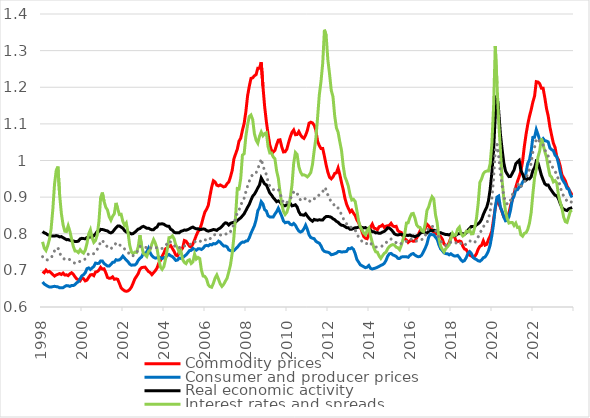
| Category | Commodity prices | Consumer and producer prices | Real economic activity | Interest rates and spreads | p.m. EA macroeconomic uncertainty |
|---|---|---|---|---|---|
| 1998-02-01 | 0.697 | 0.668 | 0.806 | 0.778 | 0.737 |
| 1998-03-01 | 0.694 | 0.663 | 0.802 | 0.761 | 0.731 |
| 1998-04-01 | 0.701 | 0.66 | 0.801 | 0.754 | 0.729 |
| 1998-05-01 | 0.696 | 0.657 | 0.797 | 0.767 | 0.728 |
| 1998-06-01 | 0.697 | 0.654 | 0.796 | 0.784 | 0.73 |
| 1998-07-01 | 0.693 | 0.655 | 0.794 | 0.813 | 0.734 |
| 1998-08-01 | 0.689 | 0.656 | 0.794 | 0.866 | 0.742 |
| 1998-09-01 | 0.684 | 0.657 | 0.794 | 0.935 | 0.753 |
| 1998-10-01 | 0.688 | 0.656 | 0.795 | 0.973 | 0.76 |
| 1998-11-01 | 0.689 | 0.655 | 0.794 | 0.983 | 0.762 |
| 1998-12-01 | 0.691 | 0.652 | 0.792 | 0.906 | 0.747 |
| 1999-01-01 | 0.689 | 0.653 | 0.792 | 0.856 | 0.739 |
| 1999-02-01 | 0.693 | 0.653 | 0.789 | 0.825 | 0.734 |
| 1999-03-01 | 0.687 | 0.656 | 0.787 | 0.807 | 0.73 |
| 1999-04-01 | 0.688 | 0.658 | 0.784 | 0.806 | 0.73 |
| 1999-05-01 | 0.686 | 0.658 | 0.784 | 0.822 | 0.732 |
| 1999-06-01 | 0.691 | 0.656 | 0.782 | 0.807 | 0.729 |
| 1999-07-01 | 0.694 | 0.659 | 0.781 | 0.786 | 0.726 |
| 1999-08-01 | 0.689 | 0.658 | 0.78 | 0.765 | 0.722 |
| 1999-09-01 | 0.682 | 0.661 | 0.779 | 0.753 | 0.719 |
| 1999-10-01 | 0.677 | 0.666 | 0.779 | 0.752 | 0.72 |
| 1999-11-01 | 0.675 | 0.669 | 0.78 | 0.749 | 0.72 |
| 1999-12-01 | 0.672 | 0.677 | 0.786 | 0.756 | 0.726 |
| 2000-01-01 | 0.68 | 0.685 | 0.788 | 0.751 | 0.729 |
| 2000-02-01 | 0.677 | 0.688 | 0.787 | 0.747 | 0.729 |
| 2000-03-01 | 0.671 | 0.694 | 0.786 | 0.755 | 0.731 |
| 2000-04-01 | 0.673 | 0.705 | 0.79 | 0.774 | 0.739 |
| 2000-05-01 | 0.681 | 0.707 | 0.79 | 0.8 | 0.746 |
| 2000-06-01 | 0.688 | 0.703 | 0.791 | 0.811 | 0.748 |
| 2000-07-01 | 0.689 | 0.707 | 0.791 | 0.789 | 0.746 |
| 2000-08-01 | 0.686 | 0.711 | 0.795 | 0.776 | 0.745 |
| 2000-09-01 | 0.696 | 0.72 | 0.799 | 0.782 | 0.753 |
| 2000-10-01 | 0.697 | 0.719 | 0.806 | 0.797 | 0.757 |
| 2000-11-01 | 0.701 | 0.719 | 0.807 | 0.834 | 0.764 |
| 2000-12-01 | 0.708 | 0.726 | 0.812 | 0.899 | 0.78 |
| 2001-01-01 | 0.703 | 0.726 | 0.812 | 0.913 | 0.782 |
| 2001-02-01 | 0.704 | 0.719 | 0.81 | 0.888 | 0.775 |
| 2001-03-01 | 0.694 | 0.715 | 0.809 | 0.872 | 0.769 |
| 2001-04-01 | 0.681 | 0.712 | 0.808 | 0.865 | 0.764 |
| 2001-05-01 | 0.678 | 0.712 | 0.804 | 0.846 | 0.759 |
| 2001-06-01 | 0.679 | 0.716 | 0.802 | 0.837 | 0.759 |
| 2001-07-01 | 0.682 | 0.722 | 0.805 | 0.848 | 0.764 |
| 2001-08-01 | 0.676 | 0.723 | 0.811 | 0.855 | 0.766 |
| 2001-09-01 | 0.677 | 0.729 | 0.817 | 0.884 | 0.775 |
| 2001-10-01 | 0.676 | 0.728 | 0.821 | 0.868 | 0.773 |
| 2001-11-01 | 0.664 | 0.729 | 0.821 | 0.852 | 0.769 |
| 2001-12-01 | 0.652 | 0.733 | 0.818 | 0.853 | 0.768 |
| 2002-01-01 | 0.648 | 0.739 | 0.815 | 0.834 | 0.765 |
| 2002-02-01 | 0.644 | 0.733 | 0.809 | 0.823 | 0.759 |
| 2002-03-01 | 0.643 | 0.728 | 0.805 | 0.829 | 0.756 |
| 2002-04-01 | 0.644 | 0.724 | 0.803 | 0.804 | 0.75 |
| 2002-05-01 | 0.648 | 0.717 | 0.802 | 0.769 | 0.742 |
| 2002-06-01 | 0.654 | 0.714 | 0.799 | 0.751 | 0.739 |
| 2002-07-01 | 0.665 | 0.715 | 0.8 | 0.746 | 0.74 |
| 2002-08-01 | 0.677 | 0.715 | 0.804 | 0.75 | 0.744 |
| 2002-09-01 | 0.684 | 0.719 | 0.808 | 0.749 | 0.748 |
| 2002-10-01 | 0.691 | 0.727 | 0.813 | 0.764 | 0.756 |
| 2002-11-01 | 0.703 | 0.733 | 0.814 | 0.796 | 0.766 |
| 2002-12-01 | 0.708 | 0.737 | 0.818 | 0.767 | 0.764 |
| 2003-01-01 | 0.708 | 0.747 | 0.82 | 0.746 | 0.765 |
| 2003-02-01 | 0.709 | 0.746 | 0.818 | 0.743 | 0.763 |
| 2003-03-01 | 0.703 | 0.75 | 0.815 | 0.738 | 0.762 |
| 2003-04-01 | 0.697 | 0.76 | 0.815 | 0.751 | 0.767 |
| 2003-05-01 | 0.694 | 0.748 | 0.813 | 0.757 | 0.762 |
| 2003-06-01 | 0.688 | 0.74 | 0.811 | 0.772 | 0.76 |
| 2003-07-01 | 0.694 | 0.736 | 0.811 | 0.784 | 0.762 |
| 2003-08-01 | 0.699 | 0.733 | 0.816 | 0.774 | 0.762 |
| 2003-09-01 | 0.706 | 0.734 | 0.818 | 0.76 | 0.762 |
| 2003-10-01 | 0.719 | 0.736 | 0.826 | 0.732 | 0.763 |
| 2003-11-01 | 0.727 | 0.735 | 0.827 | 0.709 | 0.76 |
| 2003-12-01 | 0.738 | 0.732 | 0.827 | 0.703 | 0.76 |
| 2004-01-01 | 0.747 | 0.735 | 0.826 | 0.71 | 0.763 |
| 2004-02-01 | 0.759 | 0.735 | 0.823 | 0.731 | 0.768 |
| 2004-03-01 | 0.761 | 0.741 | 0.821 | 0.757 | 0.774 |
| 2004-04-01 | 0.765 | 0.743 | 0.82 | 0.789 | 0.78 |
| 2004-05-01 | 0.768 | 0.74 | 0.812 | 0.79 | 0.777 |
| 2004-06-01 | 0.76 | 0.738 | 0.81 | 0.794 | 0.775 |
| 2004-07-01 | 0.752 | 0.733 | 0.804 | 0.786 | 0.769 |
| 2004-08-01 | 0.742 | 0.727 | 0.803 | 0.769 | 0.762 |
| 2004-09-01 | 0.74 | 0.728 | 0.803 | 0.762 | 0.761 |
| 2004-10-01 | 0.75 | 0.734 | 0.803 | 0.749 | 0.762 |
| 2004-11-01 | 0.755 | 0.733 | 0.807 | 0.753 | 0.764 |
| 2004-12-01 | 0.761 | 0.734 | 0.808 | 0.73 | 0.762 |
| 2005-01-01 | 0.782 | 0.739 | 0.81 | 0.722 | 0.767 |
| 2005-02-01 | 0.78 | 0.742 | 0.81 | 0.718 | 0.767 |
| 2005-03-01 | 0.773 | 0.748 | 0.811 | 0.727 | 0.77 |
| 2005-04-01 | 0.766 | 0.754 | 0.814 | 0.729 | 0.772 |
| 2005-05-01 | 0.763 | 0.755 | 0.816 | 0.719 | 0.771 |
| 2005-06-01 | 0.772 | 0.76 | 0.818 | 0.723 | 0.775 |
| 2005-07-01 | 0.783 | 0.757 | 0.815 | 0.744 | 0.779 |
| 2005-08-01 | 0.796 | 0.755 | 0.813 | 0.731 | 0.777 |
| 2005-09-01 | 0.806 | 0.759 | 0.814 | 0.735 | 0.781 |
| 2005-10-01 | 0.811 | 0.759 | 0.812 | 0.732 | 0.781 |
| 2005-11-01 | 0.825 | 0.757 | 0.812 | 0.7 | 0.777 |
| 2005-12-01 | 0.843 | 0.761 | 0.813 | 0.685 | 0.779 |
| 2006-01-01 | 0.859 | 0.767 | 0.812 | 0.683 | 0.783 |
| 2006-02-01 | 0.867 | 0.768 | 0.809 | 0.676 | 0.783 |
| 2006-03-01 | 0.877 | 0.767 | 0.807 | 0.66 | 0.781 |
| 2006-04-01 | 0.903 | 0.771 | 0.808 | 0.656 | 0.786 |
| 2006-05-01 | 0.927 | 0.77 | 0.81 | 0.654 | 0.79 |
| 2006-06-01 | 0.945 | 0.773 | 0.812 | 0.665 | 0.796 |
| 2006-07-01 | 0.941 | 0.772 | 0.811 | 0.679 | 0.798 |
| 2006-08-01 | 0.933 | 0.775 | 0.809 | 0.687 | 0.798 |
| 2006-09-01 | 0.931 | 0.78 | 0.813 | 0.676 | 0.799 |
| 2006-10-01 | 0.933 | 0.777 | 0.816 | 0.663 | 0.797 |
| 2006-11-01 | 0.931 | 0.771 | 0.82 | 0.656 | 0.795 |
| 2006-12-01 | 0.928 | 0.767 | 0.826 | 0.662 | 0.796 |
| 2007-01-01 | 0.929 | 0.767 | 0.83 | 0.67 | 0.799 |
| 2007-02-01 | 0.937 | 0.764 | 0.829 | 0.678 | 0.8 |
| 2007-03-01 | 0.941 | 0.756 | 0.824 | 0.696 | 0.799 |
| 2007-04-01 | 0.955 | 0.754 | 0.829 | 0.715 | 0.806 |
| 2007-05-01 | 0.973 | 0.754 | 0.83 | 0.747 | 0.814 |
| 2007-06-01 | 1.004 | 0.754 | 0.832 | 0.791 | 0.828 |
| 2007-07-01 | 1.018 | 0.759 | 0.832 | 0.848 | 0.841 |
| 2007-08-01 | 1.031 | 0.763 | 0.836 | 0.923 | 0.859 |
| 2007-09-01 | 1.053 | 0.769 | 0.84 | 0.922 | 0.865 |
| 2007-10-01 | 1.061 | 0.774 | 0.844 | 0.951 | 0.875 |
| 2007-11-01 | 1.083 | 0.777 | 0.849 | 1.015 | 0.892 |
| 2007-12-01 | 1.101 | 0.777 | 0.854 | 1.018 | 0.897 |
| 2008-01-01 | 1.133 | 0.78 | 0.863 | 1.065 | 0.914 |
| 2008-02-01 | 1.176 | 0.781 | 0.872 | 1.097 | 0.93 |
| 2008-03-01 | 1.203 | 0.789 | 0.88 | 1.12 | 0.943 |
| 2008-04-01 | 1.224 | 0.801 | 0.892 | 1.124 | 0.956 |
| 2008-05-01 | 1.226 | 0.812 | 0.902 | 1.112 | 0.961 |
| 2008-06-01 | 1.231 | 0.822 | 0.908 | 1.073 | 0.961 |
| 2008-07-01 | 1.235 | 0.838 | 0.916 | 1.055 | 0.966 |
| 2008-08-01 | 1.252 | 0.863 | 0.925 | 1.047 | 0.979 |
| 2008-09-01 | 1.252 | 0.871 | 0.933 | 1.066 | 0.988 |
| 2008-10-01 | 1.268 | 0.888 | 0.952 | 1.078 | 1.004 |
| 2008-11-01 | 1.202 | 0.882 | 0.944 | 1.068 | 0.987 |
| 2008-12-01 | 1.147 | 0.866 | 0.936 | 1.073 | 0.971 |
| 2009-01-01 | 1.106 | 0.862 | 0.934 | 1.076 | 0.962 |
| 2009-02-01 | 1.072 | 0.849 | 0.922 | 1.038 | 0.942 |
| 2009-03-01 | 1.043 | 0.846 | 0.911 | 1.021 | 0.93 |
| 2009-04-01 | 1.028 | 0.846 | 0.906 | 1.021 | 0.925 |
| 2009-05-01 | 1.023 | 0.846 | 0.899 | 1.01 | 0.92 |
| 2009-06-01 | 1.027 | 0.854 | 0.894 | 1.005 | 0.921 |
| 2009-07-01 | 1.043 | 0.86 | 0.888 | 0.972 | 0.918 |
| 2009-08-01 | 1.056 | 0.87 | 0.89 | 0.952 | 0.921 |
| 2009-09-01 | 1.057 | 0.859 | 0.887 | 0.914 | 0.91 |
| 2009-10-01 | 1.038 | 0.848 | 0.881 | 0.881 | 0.896 |
| 2009-11-01 | 1.023 | 0.835 | 0.877 | 0.861 | 0.885 |
| 2009-12-01 | 1.024 | 0.83 | 0.876 | 0.853 | 0.882 |
| 2010-01-01 | 1.031 | 0.831 | 0.879 | 0.859 | 0.885 |
| 2010-02-01 | 1.048 | 0.831 | 0.88 | 0.874 | 0.891 |
| 2010-03-01 | 1.064 | 0.826 | 0.883 | 0.897 | 0.896 |
| 2010-04-01 | 1.077 | 0.824 | 0.876 | 0.933 | 0.902 |
| 2010-05-01 | 1.083 | 0.828 | 0.877 | 0.992 | 0.914 |
| 2010-06-01 | 1.07 | 0.823 | 0.879 | 1.022 | 0.916 |
| 2010-07-01 | 1.071 | 0.815 | 0.873 | 1.017 | 0.911 |
| 2010-08-01 | 1.079 | 0.807 | 0.86 | 0.984 | 0.9 |
| 2010-09-01 | 1.07 | 0.804 | 0.852 | 0.968 | 0.892 |
| 2010-10-01 | 1.064 | 0.807 | 0.851 | 0.961 | 0.89 |
| 2010-11-01 | 1.06 | 0.814 | 0.851 | 0.961 | 0.892 |
| 2010-12-01 | 1.069 | 0.823 | 0.855 | 0.959 | 0.897 |
| 2011-01-01 | 1.082 | 0.812 | 0.848 | 0.955 | 0.893 |
| 2011-02-01 | 1.102 | 0.797 | 0.842 | 0.96 | 0.89 |
| 2011-03-01 | 1.105 | 0.79 | 0.838 | 0.967 | 0.888 |
| 2011-04-01 | 1.103 | 0.788 | 0.834 | 0.989 | 0.889 |
| 2011-05-01 | 1.096 | 0.787 | 0.839 | 1.027 | 0.896 |
| 2011-06-01 | 1.082 | 0.779 | 0.837 | 1.061 | 0.896 |
| 2011-07-01 | 1.053 | 0.776 | 0.837 | 1.118 | 0.9 |
| 2011-08-01 | 1.041 | 0.774 | 0.838 | 1.179 | 0.907 |
| 2011-09-01 | 1.033 | 0.767 | 0.838 | 1.217 | 0.91 |
| 2011-10-01 | 1.033 | 0.756 | 0.838 | 1.266 | 0.914 |
| 2011-11-01 | 1.011 | 0.752 | 0.843 | 1.357 | 0.927 |
| 2011-12-01 | 0.988 | 0.75 | 0.847 | 1.342 | 0.921 |
| 2012-01-01 | 0.968 | 0.75 | 0.847 | 1.275 | 0.906 |
| 2012-02-01 | 0.954 | 0.748 | 0.847 | 1.236 | 0.896 |
| 2012-03-01 | 0.95 | 0.743 | 0.845 | 1.191 | 0.886 |
| 2012-04-01 | 0.955 | 0.744 | 0.841 | 1.174 | 0.883 |
| 2012-05-01 | 0.965 | 0.745 | 0.839 | 1.122 | 0.876 |
| 2012-06-01 | 0.966 | 0.747 | 0.834 | 1.089 | 0.87 |
| 2012-07-01 | 0.979 | 0.751 | 0.832 | 1.077 | 0.87 |
| 2012-08-01 | 0.961 | 0.751 | 0.826 | 1.051 | 0.861 |
| 2012-09-01 | 0.94 | 0.75 | 0.823 | 1.027 | 0.852 |
| 2012-10-01 | 0.92 | 0.751 | 0.823 | 0.985 | 0.842 |
| 2012-11-01 | 0.897 | 0.751 | 0.82 | 0.955 | 0.832 |
| 2012-12-01 | 0.88 | 0.752 | 0.817 | 0.944 | 0.827 |
| 2013-01-01 | 0.869 | 0.76 | 0.817 | 0.93 | 0.825 |
| 2013-02-01 | 0.86 | 0.759 | 0.812 | 0.906 | 0.818 |
| 2013-03-01 | 0.864 | 0.762 | 0.812 | 0.892 | 0.817 |
| 2013-04-01 | 0.856 | 0.757 | 0.815 | 0.894 | 0.816 |
| 2013-05-01 | 0.85 | 0.746 | 0.816 | 0.888 | 0.81 |
| 2013-06-01 | 0.837 | 0.73 | 0.817 | 0.863 | 0.799 |
| 2013-07-01 | 0.83 | 0.723 | 0.818 | 0.835 | 0.791 |
| 2013-08-01 | 0.819 | 0.715 | 0.818 | 0.819 | 0.784 |
| 2013-09-01 | 0.806 | 0.713 | 0.817 | 0.81 | 0.779 |
| 2013-10-01 | 0.792 | 0.71 | 0.816 | 0.802 | 0.774 |
| 2013-11-01 | 0.788 | 0.707 | 0.817 | 0.797 | 0.772 |
| 2013-12-01 | 0.786 | 0.709 | 0.814 | 0.809 | 0.774 |
| 2014-01-01 | 0.798 | 0.713 | 0.814 | 0.815 | 0.778 |
| 2014-02-01 | 0.818 | 0.705 | 0.809 | 0.794 | 0.774 |
| 2014-03-01 | 0.826 | 0.704 | 0.806 | 0.776 | 0.77 |
| 2014-04-01 | 0.815 | 0.705 | 0.805 | 0.761 | 0.766 |
| 2014-05-01 | 0.814 | 0.707 | 0.802 | 0.751 | 0.764 |
| 2014-06-01 | 0.811 | 0.708 | 0.803 | 0.75 | 0.764 |
| 2014-07-01 | 0.819 | 0.711 | 0.801 | 0.739 | 0.764 |
| 2014-08-01 | 0.82 | 0.714 | 0.802 | 0.733 | 0.764 |
| 2014-09-01 | 0.824 | 0.716 | 0.805 | 0.74 | 0.767 |
| 2014-10-01 | 0.817 | 0.719 | 0.806 | 0.747 | 0.769 |
| 2014-11-01 | 0.821 | 0.727 | 0.811 | 0.75 | 0.774 |
| 2014-12-01 | 0.822 | 0.739 | 0.816 | 0.759 | 0.782 |
| 2015-01-01 | 0.823 | 0.745 | 0.815 | 0.765 | 0.785 |
| 2015-02-01 | 0.828 | 0.746 | 0.812 | 0.769 | 0.785 |
| 2015-03-01 | 0.821 | 0.742 | 0.806 | 0.77 | 0.782 |
| 2015-04-01 | 0.819 | 0.74 | 0.8 | 0.769 | 0.778 |
| 2015-05-01 | 0.82 | 0.738 | 0.797 | 0.763 | 0.776 |
| 2015-06-01 | 0.808 | 0.733 | 0.797 | 0.762 | 0.772 |
| 2015-07-01 | 0.805 | 0.733 | 0.798 | 0.756 | 0.77 |
| 2015-08-01 | 0.803 | 0.736 | 0.799 | 0.768 | 0.774 |
| 2015-09-01 | 0.793 | 0.737 | 0.796 | 0.785 | 0.774 |
| 2015-10-01 | 0.786 | 0.737 | 0.795 | 0.799 | 0.775 |
| 2015-11-01 | 0.783 | 0.737 | 0.796 | 0.829 | 0.78 |
| 2015-12-01 | 0.776 | 0.736 | 0.795 | 0.83 | 0.778 |
| 2016-01-01 | 0.781 | 0.741 | 0.796 | 0.844 | 0.783 |
| 2016-02-01 | 0.782 | 0.745 | 0.794 | 0.854 | 0.786 |
| 2016-03-01 | 0.779 | 0.746 | 0.794 | 0.856 | 0.786 |
| 2016-04-01 | 0.78 | 0.742 | 0.792 | 0.843 | 0.782 |
| 2016-05-01 | 0.788 | 0.739 | 0.794 | 0.824 | 0.78 |
| 2016-06-01 | 0.798 | 0.737 | 0.796 | 0.818 | 0.78 |
| 2016-07-01 | 0.808 | 0.738 | 0.801 | 0.817 | 0.784 |
| 2016-08-01 | 0.804 | 0.742 | 0.804 | 0.808 | 0.784 |
| 2016-09-01 | 0.805 | 0.751 | 0.803 | 0.805 | 0.787 |
| 2016-10-01 | 0.815 | 0.761 | 0.803 | 0.827 | 0.795 |
| 2016-11-01 | 0.826 | 0.772 | 0.802 | 0.863 | 0.806 |
| 2016-12-01 | 0.821 | 0.79 | 0.807 | 0.873 | 0.815 |
| 2017-01-01 | 0.814 | 0.799 | 0.81 | 0.889 | 0.82 |
| 2017-02-01 | 0.811 | 0.797 | 0.808 | 0.901 | 0.82 |
| 2017-03-01 | 0.805 | 0.797 | 0.81 | 0.895 | 0.819 |
| 2017-04-01 | 0.801 | 0.79 | 0.809 | 0.852 | 0.809 |
| 2017-05-01 | 0.799 | 0.785 | 0.807 | 0.83 | 0.802 |
| 2017-06-01 | 0.796 | 0.77 | 0.802 | 0.789 | 0.788 |
| 2017-07-01 | 0.792 | 0.759 | 0.803 | 0.766 | 0.78 |
| 2017-08-01 | 0.785 | 0.754 | 0.801 | 0.758 | 0.775 |
| 2017-09-01 | 0.772 | 0.748 | 0.799 | 0.751 | 0.77 |
| 2017-10-01 | 0.768 | 0.746 | 0.798 | 0.759 | 0.769 |
| 2017-11-01 | 0.767 | 0.746 | 0.798 | 0.765 | 0.77 |
| 2017-12-01 | 0.776 | 0.742 | 0.797 | 0.77 | 0.771 |
| 2018-01-01 | 0.789 | 0.745 | 0.8 | 0.786 | 0.777 |
| 2018-02-01 | 0.795 | 0.742 | 0.797 | 0.801 | 0.779 |
| 2018-03-01 | 0.793 | 0.739 | 0.795 | 0.795 | 0.776 |
| 2018-04-01 | 0.781 | 0.739 | 0.796 | 0.798 | 0.775 |
| 2018-05-01 | 0.779 | 0.741 | 0.799 | 0.813 | 0.779 |
| 2018-06-01 | 0.78 | 0.735 | 0.8 | 0.818 | 0.778 |
| 2018-07-01 | 0.778 | 0.728 | 0.801 | 0.8 | 0.773 |
| 2018-08-01 | 0.766 | 0.724 | 0.8 | 0.794 | 0.768 |
| 2018-09-01 | 0.758 | 0.727 | 0.799 | 0.797 | 0.768 |
| 2018-10-01 | 0.757 | 0.735 | 0.803 | 0.807 | 0.773 |
| 2018-11-01 | 0.749 | 0.746 | 0.81 | 0.805 | 0.778 |
| 2018-12-01 | 0.741 | 0.751 | 0.815 | 0.81 | 0.781 |
| 2019-01-01 | 0.739 | 0.746 | 0.82 | 0.8 | 0.779 |
| 2019-02-01 | 0.736 | 0.736 | 0.82 | 0.8 | 0.775 |
| 2019-03-01 | 0.738 | 0.732 | 0.82 | 0.818 | 0.777 |
| 2019-04-01 | 0.745 | 0.73 | 0.824 | 0.842 | 0.782 |
| 2019-05-01 | 0.758 | 0.726 | 0.827 | 0.883 | 0.791 |
| 2019-06-01 | 0.766 | 0.725 | 0.832 | 0.941 | 0.803 |
| 2019-07-01 | 0.768 | 0.729 | 0.839 | 0.95 | 0.809 |
| 2019-08-01 | 0.781 | 0.734 | 0.853 | 0.964 | 0.82 |
| 2019-09-01 | 0.769 | 0.736 | 0.863 | 0.969 | 0.823 |
| 2019-10-01 | 0.771 | 0.743 | 0.872 | 0.971 | 0.829 |
| 2019-11-01 | 0.784 | 0.753 | 0.889 | 0.971 | 0.84 |
| 2019-12-01 | 0.794 | 0.769 | 0.921 | 0.991 | 0.861 |
| 2020-01-01 | 0.808 | 0.795 | 0.966 | 1.045 | 0.896 |
| 2020-02-01 | 0.839 | 0.827 | 1.028 | 1.145 | 0.949 |
| 2020-03-01 | 0.87 | 0.872 | 1.121 | 1.313 | 1.028 |
| 2020-04-01 | 0.892 | 0.9 | 1.178 | 1.21 | 1.043 |
| 2020-05-01 | 0.884 | 0.903 | 1.135 | 1.106 | 1.011 |
| 2020-06-01 | 0.872 | 0.873 | 1.072 | 1.031 | 0.965 |
| 2020-07-01 | 0.859 | 0.861 | 1.03 | 0.946 | 0.931 |
| 2020-08-01 | 0.846 | 0.845 | 0.993 | 0.895 | 0.903 |
| 2020-09-01 | 0.842 | 0.835 | 0.971 | 0.862 | 0.886 |
| 2020-10-01 | 0.848 | 0.836 | 0.963 | 0.841 | 0.881 |
| 2020-11-01 | 0.856 | 0.846 | 0.956 | 0.829 | 0.882 |
| 2020-12-01 | 0.878 | 0.866 | 0.957 | 0.83 | 0.892 |
| 2021-01-01 | 0.892 | 0.894 | 0.965 | 0.83 | 0.907 |
| 2021-02-01 | 0.91 | 0.903 | 0.974 | 0.822 | 0.914 |
| 2021-03-01 | 0.927 | 0.921 | 0.991 | 0.829 | 0.93 |
| 2021-04-01 | 0.943 | 0.92 | 0.996 | 0.817 | 0.932 |
| 2021-05-01 | 0.956 | 0.927 | 1 | 0.818 | 0.938 |
| 2021-06-01 | 0.971 | 0.93 | 0.973 | 0.797 | 0.929 |
| 2021-07-01 | 0.998 | 0.941 | 0.963 | 0.793 | 0.933 |
| 2021-08-01 | 1.038 | 0.948 | 0.95 | 0.801 | 0.939 |
| 2021-09-01 | 1.071 | 0.966 | 0.946 | 0.803 | 0.95 |
| 2021-10-01 | 1.098 | 0.992 | 0.95 | 0.812 | 0.966 |
| 2021-11-01 | 1.12 | 1.001 | 0.95 | 0.829 | 0.975 |
| 2021-12-01 | 1.138 | 1.025 | 0.955 | 0.857 | 0.993 |
| 2022-01-01 | 1.16 | 1.063 | 0.973 | 0.908 | 1.023 |
| 2022-02-01 | 1.176 | 1.064 | 0.98 | 0.954 | 1.036 |
| 2022-03-01 | 1.215 | 1.085 | 0.998 | 0.976 | 1.059 |
| 2022-04-01 | 1.214 | 1.071 | 0.994 | 1.009 | 1.059 |
| 2022-05-01 | 1.21 | 1.056 | 0.977 | 1.026 | 1.05 |
| 2022-06-01 | 1.197 | 1.055 | 0.96 | 1.06 | 1.048 |
| 2022-07-01 | 1.197 | 1.06 | 0.948 | 1.043 | 1.043 |
| 2022-08-01 | 1.171 | 1.054 | 0.936 | 1.024 | 1.029 |
| 2022-09-01 | 1.142 | 1.053 | 0.933 | 1.009 | 1.02 |
| 2022-10-01 | 1.121 | 1.051 | 0.933 | 0.982 | 1.012 |
| 2022-11-01 | 1.091 | 1.034 | 0.924 | 0.959 | 0.994 |
| 2022-12-01 | 1.069 | 1.03 | 0.918 | 0.954 | 0.986 |
| 2023-01-01 | 1.047 | 1.027 | 0.911 | 0.942 | 0.977 |
| 2023-02-01 | 1.036 | 1.014 | 0.905 | 0.945 | 0.97 |
| 2023-03-01 | 1.011 | 1.01 | 0.904 | 0.939 | 0.963 |
| 2023-04-01 | 1.002 | 0.992 | 0.896 | 0.906 | 0.947 |
| 2023-05-01 | 0.985 | 0.969 | 0.883 | 0.887 | 0.929 |
| 2023-06-01 | 0.961 | 0.951 | 0.872 | 0.871 | 0.913 |
| 2023-07-01 | 0.953 | 0.942 | 0.868 | 0.846 | 0.903 |
| 2023-08-01 | 0.945 | 0.935 | 0.865 | 0.833 | 0.896 |
| 2023-09-01 | 0.93 | 0.924 | 0.863 | 0.831 | 0.889 |
| 2023-10-01 | 0.922 | 0.922 | 0.868 | 0.846 | 0.892 |
| 2023-11-01 | 0.914 | 0.907 | 0.87 | 0.862 | 0.888 |
| 2023-12-01 | 0.905 | 0.899 | 0.872 | 0.864 | 0.885 |